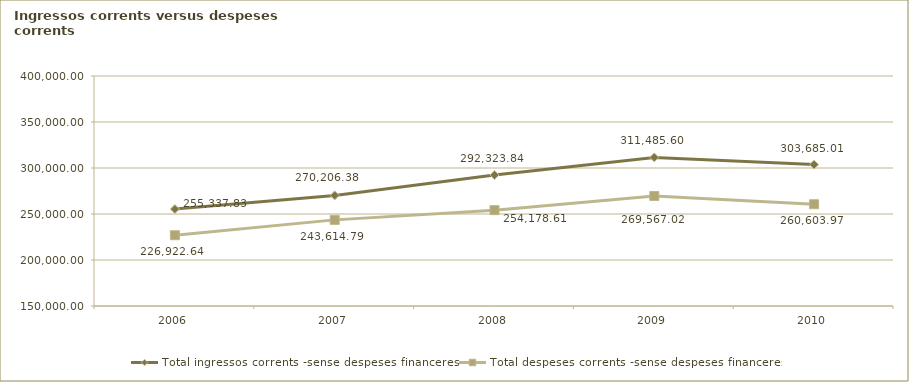
| Category | Total ingressos corrents -sense despeses financeres-  | Total despeses corrents -sense despeses financeres- |
|---|---|---|
| 2006.0 | 255337.831 | 226922.64 |
| 2007.0 | 270206.383 | 243614.785 |
| 2008.0 | 292323.843 | 254178.609 |
| 2009.0 | 311485.599 | 269567.017 |
| 2010.0 | 303685.013 | 260603.967 |